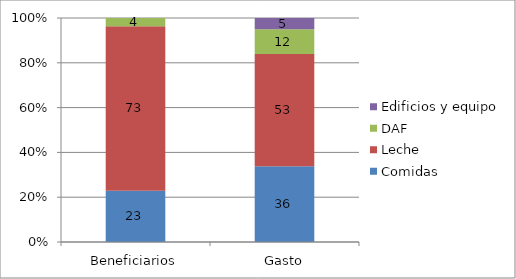
| Category | Comidas | Leche | DAF | Edificios y equipo |
|---|---|---|---|---|
| Beneficiarios | 22.918 | 73.438 | 3.644 | 0 |
| Gasto | 35.624 | 52.699 | 11.677 | 5.229 |